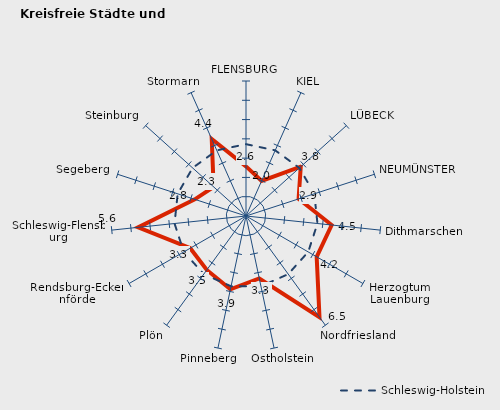
| Category | Kreise | Schleswig-Holstein |
|---|---|---|
| FLENSBURG | 2.572 | 3.725 |
| KIEL | 1.994 | 3.725 |
| LÜBECK | 3.819 | 3.725 |
| NEUMÜNSTER | 2.868 | 3.725 |
| Dithmarschen | 4.466 | 3.725 |
| Herzogtum Lauenburg | 4.231 | 3.725 |
| Nordfriesland | 6.484 | 3.725 |
| Ostholstein | 3.31 | 3.725 |
| Pinneberg | 3.884 | 3.725 |
| Plön | 3.459 | 3.725 |
| Rendsburg-Eckernförde | 3.337 | 3.725 |
| Schleswig-Flensburg | 5.625 | 3.725 |
| Segeberg | 2.79 | 3.725 |
| Steinburg | 2.258 | 3.725 |
| Stormarn | 4.367 | 3.725 |